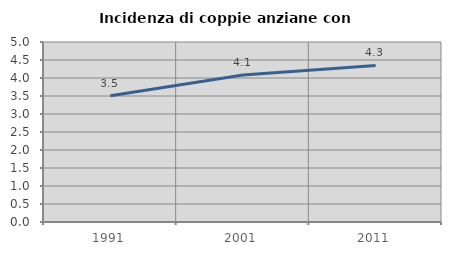
| Category | Incidenza di coppie anziane con figli |
|---|---|
| 1991.0 | 3.509 |
| 2001.0 | 4.082 |
| 2011.0 | 4.348 |